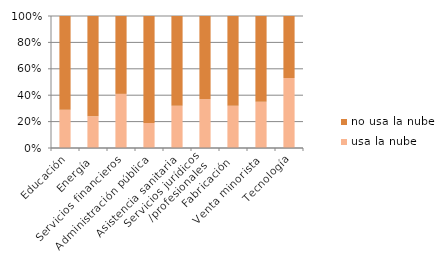
| Category | usa la nube | no usa la nube |
|---|---|---|
| Educación | 0.29 | 0.71 |
| Energía | 0.24 | 0.76 |
| Servicios financieros | 0.41 | 0.59 |
| Administración pública | 0.19 | 0.81 |
| Asistencia sanitaria | 0.32 | 0.68 |
| Servicios jurídicos
/profesionales | 0.37 | 0.63 |
| Fabricación | 0.32 | 0.68 |
| Venta minorista | 0.35 | 0.65 |
| Tecnología | 0.53 | 0.47 |